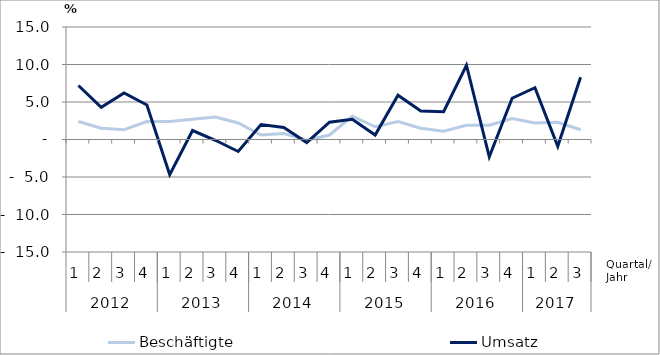
| Category | Beschäftigte | Umsatz |
|---|---|---|
| 0 | 2.4 | 7.2 |
| 1 | 1.5 | 4.3 |
| 2 | 1.3 | 6.2 |
| 3 | 2.4 | 4.6 |
| 4 | 2.4 | -4.7 |
| 5 | 2.7 | 1.2 |
| 6 | 3 | -0.1 |
| 7 | 2.2 | -1.6 |
| 8 | 0.6 | 2 |
| 9 | 0.8 | 1.6 |
| 10 | -0.1 | -0.4 |
| 11 | 0.6 | 2.3 |
| 12 | 3.1 | 2.7 |
| 13 | 1.7 | 0.6 |
| 14 | 2.4 | 5.9 |
| 15 | 1.5 | 3.8 |
| 16 | 1.1 | 3.7 |
| 17 | 1.9 | 9.9 |
| 18 | 1.9 | -2.3 |
| 19 | 2.8 | 5.5 |
| 20 | 2.2 | 6.9 |
| 21 | 2.3 | -0.9 |
| 22 | 1.3 | 8.3 |